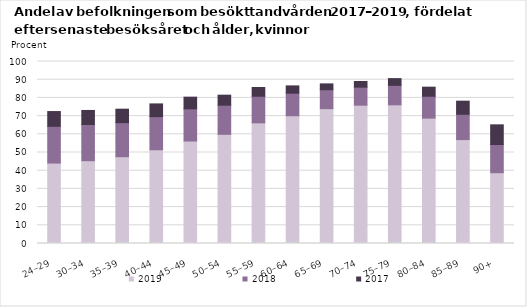
| Category | 2019 | 2018 | 2017 |
|---|---|---|---|
| 24–29 | 44.2 | 20.2 | 8.1 |
| 30–34 | 45.5 | 19.9 | 7.7 |
| 35–39 | 47.7 | 18.7 | 7.4 |
| 40–44 | 51.5 | 18.2 | 7 |
| 45–49 | 56.3 | 17.7 | 6.4 |
| 50–54 | 60 | 16 | 5.5 |
| 55–59 | 66.3 | 14.6 | 4.8 |
| 60–64 | 70.2 | 12.4 | 4 |
| 65–69 | 74.1 | 10.4 | 3.2 |
| 70–74 | 76 | 9.9 | 3.1 |
| 75–79 | 76.2 | 10.7 | 3.7 |
| 80–84 | 68.9 | 12 | 5 |
| 85–89 | 57.1 | 13.9 | 7.2 |
| 90+ | 38.9 | 15.5 | 10.8 |